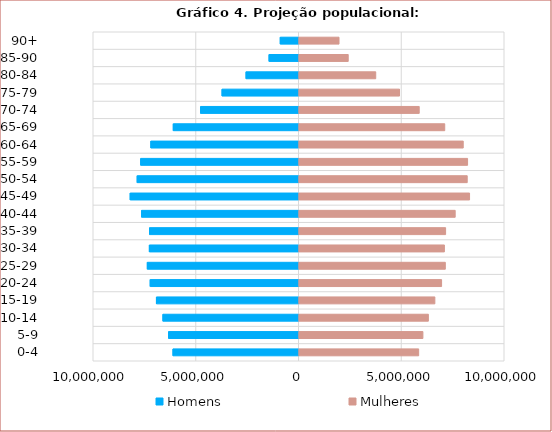
| Category | Homens  | Mulheres |
|---|---|---|
| 0-4 | -6132043 | 5847195 |
| 5-9 | -6345822 | 6053551 |
| 10-14 | -6621345 | 6319417 |
| 15-19 | -6936806 | 6635057 |
| 20-24 | -7241380 | 6962566 |
| 25-29 | -7380713 | 7144248 |
| 30-34 | -7281677 | 7099349 |
| 35-39 | -7274845 | 7158362 |
| 40-44 | -7659150 | 7624247 |
| 45-49 | -8215443 | 8323746 |
| 50-54 | -7874764 | 8210111 |
| 55-59 | -7704363 | 8227267 |
| 60-64 | -7209866 | 8016235 |
| 65-69 | -6117373 | 7115536 |
| 70-74 | -4788775 | 5874274 |
| 75-79 | -3744109 | 4915432 |
| 80-84 | -2576080 | 3758266 |
| 85-90 | -1457337 | 2419249 |
| 90+ | -912170 | 1971456 |